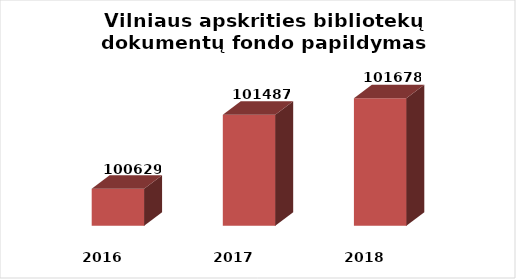
| Category | Series 0 |
|---|---|
| 2016.0 | 100629 |
| 2017.0 | 101487 |
| 2018.0 | 101678 |